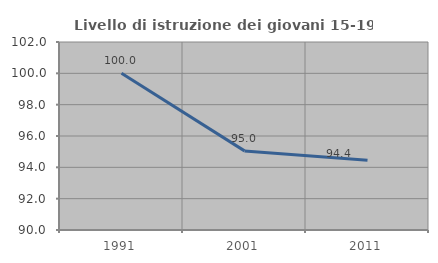
| Category | Livello di istruzione dei giovani 15-19 anni |
|---|---|
| 1991.0 | 100 |
| 2001.0 | 95.05 |
| 2011.0 | 94.444 |